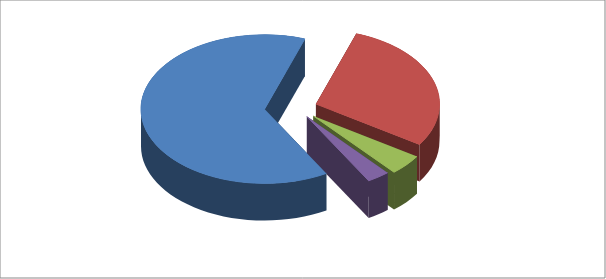
| Category | Series 0 |
|---|---|
| Impozite și taxe | 29231 |
| Contribuții și prime de asigurări obligatorii | 13271.1 |
| Alte venituri | 2071.8 |
| Granturi primite | 1373 |